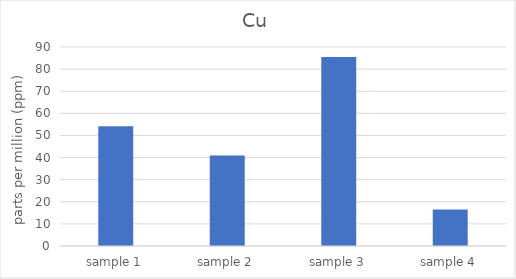
| Category | Cu |
|---|---|
| sample 1 | 54.16 |
| sample 2 | 40.92 |
| sample 3 | 85.5 |
| sample 4 | 16.55 |